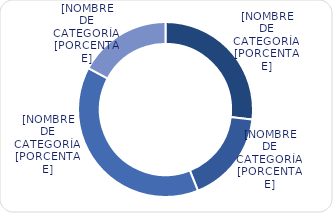
| Category | Series 0 |
|---|---|
| Entre 1-5 años | 4075.3 |
| Entre 6-10 años | 2600 |
| Entre 11-20 años | 5902.7 |
| Mayores de 20 años | 2607.2 |